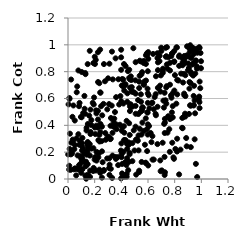
| Category | Series 0 |
|---|---|
| 0.9206579963663208 | 0.797 |
| 0.4158077181605829 | 0.562 |
| 0.3120428770809936 | 0.107 |
| 0.8353106009330821 | 0.921 |
| 0.7339869307414821 | 0.911 |
| 0.21308055101903886 | 0.489 |
| 0.28270051747507824 | 0.292 |
| 0.9456667624345371 | 0.695 |
| 0.08271187156841116 | 0.543 |
| 0.3836603406586898 | 0.555 |
| 0.5448585949675732 | 0.501 |
| 0.7635212476554524 | 0.202 |
| 0.5504686050921789 | 0.78 |
| 0.4056419928539269 | 0.042 |
| 0.48161962206379433 | 0.652 |
| 0.4021259850755091 | 0.186 |
| 0.7273541224507231 | 0.05 |
| 0.2598293609247199 | 0.125 |
| 0.8530634626550466 | 0.852 |
| 0.45638774144367006 | 0.272 |
| 0.30821040089644225 | 0.081 |
| 0.7743683591543493 | 0.916 |
| 0.46207957422139495 | 0.184 |
| 0.23543787546274828 | 0.07 |
| 0.9670457039037931 | 0.823 |
| 0.4400476172596531 | 0.038 |
| 0.4431681908915374 | 0.272 |
| 0.23539181364033687 | 0.329 |
| 0.22451633668062942 | 0.507 |
| 0.4222119321072056 | 0.345 |
| 0.7659264997425803 | 0.866 |
| 0.943451809159553 | 0.551 |
| 0.1052541292295466 | 0.213 |
| 0.9285462002775313 | 0.977 |
| 0.5384748120413075 | 0.374 |
| 0.09922966054547953 | 0.153 |
| 0.949910518939072 | 0.96 |
| 0.20065670655835888 | 0.911 |
| 0.20310304100490315 | 0.163 |
| 0.8194285080062899 | 0.63 |
| 0.5844049880543402 | 0.923 |
| 0.4245124199888307 | 0.017 |
| 0.7957365921333248 | 0.873 |
| 0.5113162440353053 | 0.033 |
| 0.3892200685994344 | 0.405 |
| 0.22201160205907025 | 0.196 |
| 0.993907332759356 | 0.939 |
| 0.5468281498382376 | 0.631 |
| 0.7265102340048437 | 0.448 |
| 0.42182547996855874 | 0.659 |
| 0.9105993135475782 | 0.722 |
| 0.213982639319976 | 0.202 |
| 0.45675928131970034 | 0.127 |
| 0.6337600474479511 | 0.144 |
| 0.3308143528940674 | 0.008 |
| 0.17433334105003712 | 0.227 |
| 0.4629848237053344 | 0.328 |
| 0.465089344490737 | 0.681 |
| 0.9150889705289293 | 0.966 |
| 0.5512959611973434 | 0.331 |
| 0.4782303546606073 | 0.685 |
| 0.8705799180205531 | 0.881 |
| 0.2277124982287225 | 0.161 |
| 0.01112948284223116 | 0.597 |
| 0.05082214313926906 | 0.436 |
| 0.7855892328342527 | 0.639 |
| 0.876214572791075 | 0.865 |
| 0.5985813824788243 | 0.803 |
| 0.5939450579727724 | 0.923 |
| 0.15911137667687214 | 0.472 |
| 0.871272367851718 | 0.637 |
| 0.06389019896030526 | 0.303 |
| 0.7648062874689028 | 0.703 |
| 0.023321956539000453 | 0.741 |
| 0.3470115873342328 | 0.45 |
| 0.4431112977337718 | 0.155 |
| 0.4718060592533276 | 0.555 |
| 0.7792253778191666 | 0.497 |
| 0.12958702128835503 | 0.026 |
| 0.24168110020162487 | 0.046 |
| 0.10893347105673439 | 0.074 |
| 0.8910697622226316 | 0.918 |
| 0.37617730925346315 | 0.103 |
| 0.1996728586670031 | 0.145 |
| 0.7254110164333968 | 0.343 |
| 0.15147871556221507 | 0.226 |
| 0.9504573136855049 | 0.869 |
| 0.1352611008309799 | 0.129 |
| 0.39672147773410876 | 0.212 |
| 0.538240381553302 | 0.882 |
| 0.11910773708450931 | 0.188 |
| 0.9423875325477266 | 0.619 |
| 0.46391360395979586 | 0.743 |
| 0.8130478310451714 | 0.98 |
| 0.3207285795626817 | 0.3 |
| 0.9661767191671596 | 0.839 |
| 0.29467048754694347 | 0.519 |
| 0.4660287046007808 | 0.557 |
| 0.32213281223442497 | 0.455 |
| 0.464483341374274 | 0.541 |
| 0.08434316095264624 | 0.255 |
| 0.5570111082573587 | 0.532 |
| 0.0013983276838097289 | 0.183 |
| 0.9801957261488091 | 0.593 |
| 0.77238509620792 | 0.622 |
| 0.8185539464837522 | 0.3 |
| 0.7961214594318241 | 0.953 |
| 0.5915672727278681 | 0.371 |
| 0.4207207834494755 | 0.291 |
| 0.008671611902048957 | 0.07 |
| 0.9076809227668415 | 0.485 |
| 0.5973254152104879 | 0.495 |
| 0.780407533987411 | 0.934 |
| 0.7453705278236127 | 0.823 |
| 0.9545694579969923 | 0.786 |
| 0.41908205053970743 | 0.393 |
| 0.028572492882195547 | 0.189 |
| 0.5055852287548122 | 0.735 |
| 0.26714268041988587 | 0.061 |
| 0.188762867013501 | 0.059 |
| 0.5934806583749638 | 0.208 |
| 0.24109285320952015 | 0.964 |
| 0.3550657296688981 | 0.164 |
| 0.1392213864366592 | 0.381 |
| 0.6860443283646659 | 0.878 |
| 0.7976810002735821 | 0.659 |
| 0.6931102946344303 | 0.651 |
| 0.9372300836659356 | 0.977 |
| 0.047436343731645805 | 0.223 |
| 0.1686045664436286 | 0.335 |
| 0.07773162321682887 | 0.334 |
| 0.6502205833137428 | 0.611 |
| 0.16388107222321982 | 0.175 |
| 0.5916074672103301 | 0.936 |
| 0.35937850822188167 | 0.15 |
| 0.5073067200827881 | 0.87 |
| 0.36444032194835047 | 0.371 |
| 0.7192081990578212 | 0.532 |
| 0.9868696673002595 | 0.529 |
| 0.7855783872839376 | 0.543 |
| 0.7652555576892625 | 0.446 |
| 0.776165934141316 | 0.606 |
| 0.35228363453854306 | 0.499 |
| 0.5475645310159162 | 0.576 |
| 0.633040521982832 | 0.319 |
| 0.3418507172043201 | 0.427 |
| 0.9919981623937305 | 0.677 |
| 0.8902206409227389 | 0.244 |
| 0.11946615598448743 | 0.129 |
| 0.014706523977364133 | 0.338 |
| 0.3482252125675912 | 0.386 |
| 0.05156671501705661 | 0.254 |
| 0.10430662320487442 | 0.133 |
| 0.5832718326707551 | 0.452 |
| 0.11552126947045749 | 0.221 |
| 0.47119522743714926 | 0.765 |
| 0.73743510612054 | 0.561 |
| 0.790652566889027 | 0.161 |
| 0.8722488884327231 | 0.625 |
| 0.8551936512262877 | 0.905 |
| 0.16608359542920462 | 0.062 |
| 0.6699656102208051 | 0.937 |
| 0.22355861151065476 | 0.383 |
| 0.5335369972331315 | 0.725 |
| 0.7239735480127207 | 0.165 |
| 0.01242114049879411 | 0.225 |
| 0.11399079384010528 | 0.492 |
| 0.8597936148239469 | 0.87 |
| 0.05174462197871446 | 0.079 |
| 0.9261837409893687 | 0.903 |
| 0.5476247493034484 | 0.876 |
| 0.5966442560685067 | 0.673 |
| 0.8176953290144803 | 0.205 |
| 0.3113626856784867 | 0.031 |
| 0.41518312664218365 | 0.741 |
| 0.828466058964925 | 0.734 |
| 0.44400986097414835 | 0.224 |
| 0.19077291116862613 | 0.864 |
| 0.9857452448741214 | 0.573 |
| 0.3629446221023996 | 0.406 |
| 0.04059397370999288 | 0.548 |
| 0.833513774909527 | 0.843 |
| 0.00949074450988487 | 0.099 |
| 0.8991664953540845 | 0.915 |
| 0.45917447784559895 | 0.814 |
| 0.567790546217495 | 0.358 |
| 0.25486612900514477 | 0.206 |
| 0.7100086873464799 | 0.27 |
| 0.8486050718433689 | 0.785 |
| 0.5072686861812367 | 0.636 |
| 0.4514125281295127 | 0.066 |
| 0.035258049893647316 | 0.294 |
| 0.14881695883233734 | 0.41 |
| 0.2544600397124745 | 0.01 |
| 0.24282285512297874 | 0.35 |
| 0.03313562704283693 | 0.463 |
| 0.10384617373136162 | 0.267 |
| 0.20817430101732778 | 0.888 |
| 0.601839856168552 | 0.895 |
| 0.9030839541253202 | 0.982 |
| 0.30762320166936974 | 0.558 |
| 0.1345953510054321 | 0.096 |
| 0.8686235899519622 | 0.783 |
| 0.5291100003794487 | 0.325 |
| 0.4401346430826675 | 0.017 |
| 0.13760687766853316 | 0.108 |
| 0.4282246540133211 | 0.699 |
| 0.029033800279547956 | 0.198 |
| 0.9321137079429141 | 0.853 |
| 0.1855814386240499 | 0.567 |
| 0.07971540379036841 | 0.074 |
| 0.2255815960989776 | 0.723 |
| 0.9531098551068639 | 0.49 |
| 0.5165390090018145 | 0.297 |
| 0.5985806582909211 | 0.568 |
| 0.9067126751497371 | 0.827 |
| 0.4374387231984106 | 0.104 |
| 0.5850731509307061 | 0.734 |
| 0.2522389919843574 | 0.282 |
| 0.6919926908393915 | 0.138 |
| 0.020789694825383714 | 0.068 |
| 0.8803266171534851 | 0.466 |
| 0.45839233795772527 | 0.416 |
| 0.859748807996846 | 0.378 |
| 0.07793085686396868 | 0.809 |
| 0.9119936054350752 | 0.984 |
| 0.7458391047432884 | 0.345 |
| 0.010131367339377554 | 0.604 |
| 0.1311258255084955 | 0.781 |
| 0.6257990167693787 | 0.275 |
| 0.24259745923959905 | 0.645 |
| 0.13640831368471298 | 0.002 |
| 0.12792530246459943 | 0.486 |
| 0.6597232990980351 | 0.766 |
| 0.1248874718033443 | 0.524 |
| 0.6594583139827579 | 0.475 |
| 0.09068123108904709 | 0.11 |
| 0.7032388616892022 | 0.064 |
| 0.9182616481753186 | 0.905 |
| 0.6381316520127092 | 0.932 |
| 0.5296275658964578 | 0.213 |
| 0.9105090175069699 | 0.674 |
| 0.4425435414763776 | 0.262 |
| 0.0866948743139844 | 0.567 |
| 0.14123030872942785 | 0.181 |
| 0.40604260128188824 | 0.112 |
| 0.17593335363351154 | 0.401 |
| 0.10671178940783553 | 0.241 |
| 0.8332513183664992 | 0.034 |
| 0.07159536624132712 | 0.176 |
| 0.5843928676573507 | 0.858 |
| 0.14944804154111227 | 0.24 |
| 0.7243217582553553 | 0.643 |
| 0.10230535087278184 | 0.46 |
| 0.5683811143086209 | 0.88 |
| 0.1437617036100868 | 0.269 |
| 0.7855983068391169 | 0.459 |
| 0.2021412746206983 | 0.857 |
| 0.8798821942164814 | 0.773 |
| 0.6292569843384186 | 0.565 |
| 0.6746347049807131 | 0.869 |
| 0.7421063605363283 | 0.983 |
| 0.4771846751334685 | 0.651 |
| 0.9499151368108258 | 0.296 |
| 0.16300788346144007 | 0.26 |
| 0.3998251970516201 | 0.58 |
| 0.777720939244854 | 0.458 |
| 0.8556736177022598 | 0.381 |
| 0.643419228487848 | 0.52 |
| 0.8600180471936898 | 0.848 |
| 0.5255871449472829 | 0.588 |
| 0.4033472744368696 | 0.697 |
| 0.5992613074361208 | 0.407 |
| 0.4493633143214666 | 0.804 |
| 0.8165725938891432 | 0.981 |
| 0.20109473789649027 | 0.384 |
| 0.8125536610122756 | 0.561 |
| 0.9596028060143798 | 0.884 |
| 0.22451012079057556 | 0.945 |
| 0.5678329438056692 | 0.864 |
| 0.3213235003286398 | 0.076 |
| 0.1458538282528606 | 0.26 |
| 0.45882697701397085 | 0.754 |
| 0.8989530230667316 | 0.809 |
| 0.4395929888158241 | 0.433 |
| 0.2247103229168587 | 0.443 |
| 0.6075230161149807 | 0.395 |
| 0.8807904000166021 | 0.618 |
| 0.6709443839747424 | 0.26 |
| 0.22792700392140208 | 0.29 |
| 0.07218151176010766 | 0.073 |
| 0.6947789996579377 | 0.058 |
| 0.7529692559600895 | 0.907 |
| 0.3357804640401062 | 0.396 |
| 0.5333756241231657 | 0.052 |
| 0.4437611902699906 | 0.576 |
| 0.3930282536546783 | 0.618 |
| 0.3979048339256537 | 0.005 |
| 0.9843431064360492 | 0.983 |
| 0.10705634807216055 | 0.157 |
| 0.5068506320411539 | 0.545 |
| 0.7107482012018417 | 0.79 |
| 0.8864765090671368 | 0.305 |
| 0.19310792554419803 | 0.555 |
| 0.06131953134036935 | 0.027 |
| 0.5685359872448764 | 0.707 |
| 0.7375689873592028 | 0.915 |
| 0.6018575039176264 | 0.946 |
| 0.6710106002684412 | 0.901 |
| 0.3984367131045802 | 0.907 |
| 0.5581555108955356 | 0.529 |
| 0.49328177648781885 | 0.363 |
| 0.7320139701004647 | 0.587 |
| 0.31872583789119574 | 0.397 |
| 0.9688941262517016 | 0.015 |
| 0.7247219801035383 | 0.03 |
| 0.8779527885614529 | 0.487 |
| 0.2774300906929792 | 0.728 |
| 0.8898728701923683 | 0.92 |
| 0.10828657290868919 | 0.306 |
| 0.26926839993949303 | 0.067 |
| 0.5721598136781618 | 0.726 |
| 0.19559308118333968 | 0.608 |
| 0.5338910286595773 | 0.062 |
| 0.6015711562240776 | 0.101 |
| 0.42156888217372457 | 0.705 |
| 0.05290609104027257 | 0.077 |
| 0.3105308120922005 | 0.859 |
| 0.6050480853201528 | 0.625 |
| 0.7367857562721403 | 0.682 |
| 0.9973785953215607 | 0.826 |
| 0.3987237573573671 | 0.963 |
| 0.2140654445466696 | 0.137 |
| 0.6434311408650671 | 0.145 |
| 0.08735828305670115 | 0.286 |
| 0.30603708744686237 | 0.313 |
| 0.06920817314970357 | 0.69 |
| 0.6998727914544386 | 0.954 |
| 0.9416386504848361 | 0.93 |
| 0.21183938293747623 | 0.397 |
| 0.12318853674436775 | 0.619 |
| 0.40046042973019474 | 0.265 |
| 0.20878297190945366 | 0.063 |
| 0.5560577484183308 | 0.796 |
| 0.19042617453663588 | 0.23 |
| 0.37806561269244426 | 0.743 |
| 0.7971104824271442 | 0.876 |
| 0.09667408300183457 | 0.462 |
| 0.14761963869336864 | 0.856 |
| 0.23107940176842498 | 0.19 |
| 0.4278539899351959 | 0.125 |
| 0.4035415102201154 | 0.36 |
| 0.5578371055817327 | 0.421 |
| 0.14835988267168787 | 0.275 |
| 0.9152554220606132 | 0.549 |
| 0.6566507129306031 | 0.486 |
| 0.1111541160748035 | 0.216 |
| 0.2350126373179629 | 0.714 |
| 0.6197458727582099 | 0.343 |
| 0.46230128930470926 | 0.194 |
| 0.857302783390963 | 0.455 |
| 0.6988826040146613 | 0.978 |
| 0.06547824833566235 | 0.646 |
| 0.1485332897872813 | 0.032 |
| 0.5337113318749944 | 0.678 |
| 0.41991523633904815 | 0.857 |
| 0.09051084717383218 | 0.17 |
| 0.360911577693665 | 0.61 |
| 0.16989027511938645 | 0.35 |
| 0.5945398608982372 | 0.497 |
| 0.6791179847356325 | 0.68 |
| 0.9169918781309558 | 0.997 |
| 0.40697378166658293 | 0.387 |
| 0.31640630739219944 | 0.297 |
| 0.9873847725314978 | 0.726 |
| 0.7949081254876003 | 0.15 |
| 0.4809704683352254 | 0.538 |
| 0.49018471693493165 | 0.975 |
| 0.5373404972083116 | 0.769 |
| 0.20514011664655846 | 0.335 |
| 0.8721010315390538 | 0.917 |
| 0.7512356976599788 | 0.468 |
| 0.7818792870094639 | 0.27 |
| 0.33602055398433667 | 0.742 |
| 0.57686004894217 | 0.255 |
| 0.6324443401991671 | 0.57 |
| 0.9389168791254736 | 0.771 |
| 0.8436919551063009 | 0.219 |
| 0.8801145311033335 | 0.906 |
| 0.9868935682931985 | 0.977 |
| 0.8019549938107934 | 0.774 |
| 0.805542409047916 | 0.224 |
| 0.9210878394301889 | 0.238 |
| 0.780229665364891 | 0.935 |
| 0.4945772727358627 | 0.646 |
| 0.715509408082112 | 0.584 |
| 0.7403156205012983 | 0.692 |
| 0.0815314129512775 | 0.101 |
| 0.49842804561322207 | 0.213 |
| 0.5075584520303256 | 0.486 |
| 0.8630736900660995 | 0.719 |
| 0.9121495395272297 | 0.942 |
| 0.29729157440694104 | 0.316 |
| 0.7318790870174974 | 0.978 |
| 0.5278687909257919 | 0.484 |
| 0.9419683058201236 | 0.548 |
| 0.2108691513490548 | 0.512 |
| 0.5684806638559528 | 0.702 |
| 0.5551449547017995 | 0.51 |
| 0.4062632648729113 | 0.745 |
| 0.4018885882445375 | 0.162 |
| 0.3007749248501847 | 0.75 |
| 0.03694296667176091 | 0.283 |
| 0.5237380890701333 | 0.285 |
| 0.6718103285347659 | 0.539 |
| 0.6743673159137573 | 0.811 |
| 0.7213931659252573 | 0.411 |
| 0.9839547939350171 | 0.614 |
| 0.8328205850358149 | 0.912 |
| 0.3568899841513345 | 0.899 |
| 0.7102347140115218 | 0.806 |
| 0.16501140962324554 | 0.016 |
| 0.44522038639957334 | 0.639 |
| 0.6107723370640755 | 0.527 |
| 0.33387018279221353 | 0.344 |
| 0.020565692733179295 | 0.184 |
| 0.29345881442468824 | 0.153 |
| 0.2660118276702779 | 0.56 |
| 0.902305368583397 | 0.861 |
| 0.3988469112783059 | 0.814 |
| 0.9803171530221629 | 0.607 |
| 0.14171651696114293 | 0.206 |
| 0.43234660801805447 | 0.841 |
| 0.431592272406884 | 0.29 |
| 0.8192383852107722 | 0.738 |
| 0.7594983204510785 | 0.371 |
| 0.10339833349059753 | 0.797 |
| 0.5092933125492373 | 0.292 |
| 0.279570338723108 | 0.343 |
| 0.2546832596303336 | 0.39 |
| 0.997781717352732 | 0.878 |
| 0.12942621125441808 | 0.79 |
| 0.6963666871909162 | 0.772 |
| 0.24819880489982227 | 0.543 |
| 0.09881315950276624 | 0.046 |
| 0.43143486517039126 | 0.706 |
| 0.7415368554733555 | 0.854 |
| 0.4555882857805377 | 0.255 |
| 0.2366952742645563 | 0.28 |
| 0.19233110362441352 | 0.083 |
| 0.14414340937282302 | 0.196 |
| 0.5607452889274825 | 0.535 |
| 0.04451352321331888 | 0.072 |
| 0.3278557754548327 | 0.547 |
| 0.970579477218177 | 0.941 |
| 0.13888582242711783 | 0.361 |
| 0.7125476201437916 | 0.822 |
| 0.4645424456450834 | 0.507 |
| 0.25659103609910516 | 0.474 |
| 0.4744230107685663 | 0.738 |
| 0.6872682552613286 | 0.918 |
| 0.5824288259065544 | 0.122 |
| 0.48299072712932756 | 0.133 |
| 0.4830049445585843 | 0.268 |
| 0.9590643493671106 | 0.113 |
| 0.5973896485937951 | 0.331 |
| 0.9670942434352623 | 0.971 |
| 0.5983256536700425 | 0.639 |
| 0.6740889551890756 | 0.679 |
| 0.3734588806432424 | 0.163 |
| 0.31064415719900845 | 0.154 |
| 0.8689994681944615 | 0.464 |
| 0.9208847742666246 | 0.546 |
| 0.8928142241307718 | 0.989 |
| 0.4119620282626743 | 0.692 |
| 0.9201090503972003 | 0.714 |
| 0.1477937695602994 | 0.11 |
| 0.6575067698840201 | 0.632 |
| 0.24360985621237366 | 0.41 |
| 0.7650743514629031 | 0.809 |
| 0.3338614578269154 | 0.175 |
| 0.4161336320940195 | 0.203 |
| 0.1686184283696371 | 0.517 |
| 0.5839529901054299 | 0.119 |
| 0.6907443334189708 | 0.696 |
| 0.24328801061722796 | 0.643 |
| 0.925867809792364 | 0.783 |
| 0.9494908385784541 | 0.586 |
| 0.5068593510902033 | 0.39 |
| 0.004268520867028132 | 0.556 |
| 0.26954984324070463 | 0.857 |
| 0.1752555847083054 | 0.439 |
| 0.9411302065014182 | 0.863 |
| 0.5522694333181991 | 0.127 |
| 0.02497987184166447 | 0.271 |
| 0.1632294678494957 | 0.955 |
| 0.7268889660304179 | 0.421 |
| 0.3297296137202529 | 0.949 |
| 0.9404107383985986 | 0.961 |
| 0.4104427586470252 | 0.029 |